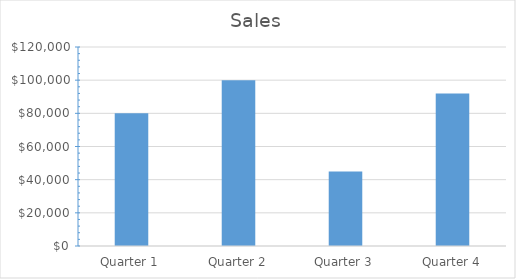
| Category | Sales |
|---|---|
| Quarter 1 | 80000 |
| Quarter 2 | 100000 |
| Quarter 3 | 45000 |
| Quarter 4 | 92000 |